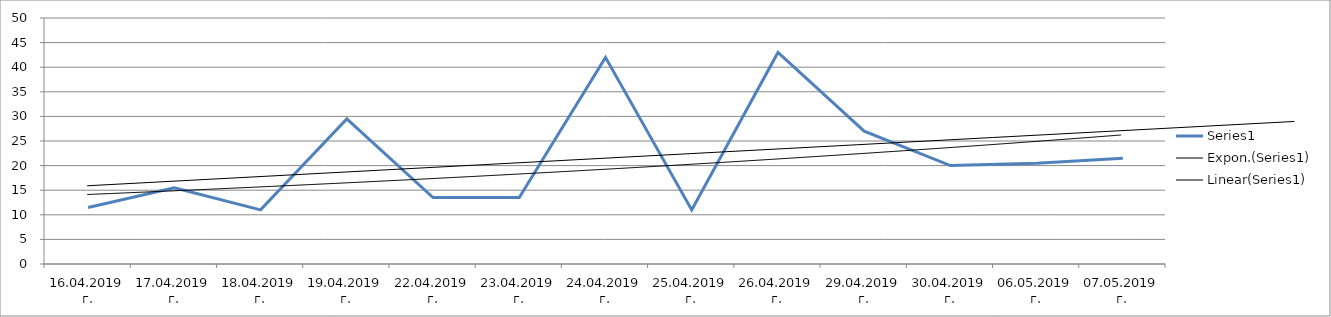
| Category | Series 0 |
|---|---|
| 16.04.2019 г. | 11.5 |
| 17.04.2019 г. | 15.5 |
| 18.04.2019 г. | 11 |
| 19.04.2019 г. | 29.5 |
| 22.04.2019 г. | 13.5 |
| 23.04.2019 г. | 13.5 |
| 24.04.2019 г. | 42 |
| 25.04.2019 г. | 11 |
| 26.04.2019 г. | 43 |
| 29.04.2019 г. | 27 |
| 30.04.2019 г. | 20 |
| 06.05.2019 г. | 20.5 |
| 07.05.2019 г. | 21.5 |